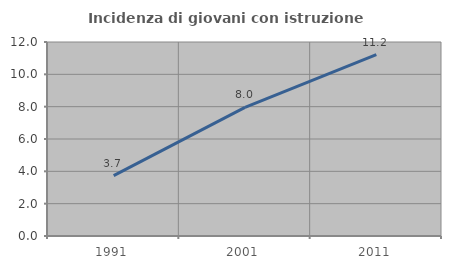
| Category | Incidenza di giovani con istruzione universitaria |
|---|---|
| 1991.0 | 3.731 |
| 2001.0 | 7.955 |
| 2011.0 | 11.224 |